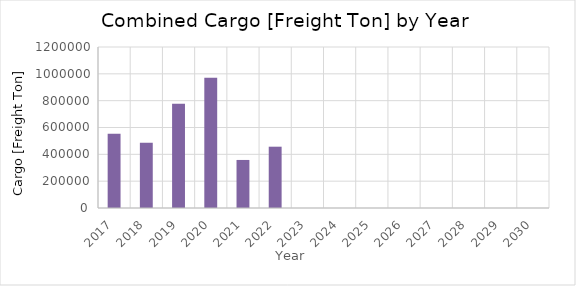
| Category | Total |
|---|---|
| 2017.0 | 553280 |
| 2018.0 | 486761 |
| 2019.0 | 777741 |
| 2020.0 | 970815 |
| 2021.0 | 358114 |
| 2022.0 | 456925 |
| 2023.0 | 0 |
| 2024.0 | 0 |
| 2025.0 | 0 |
| 2026.0 | 0 |
| 2027.0 | 0 |
| 2028.0 | 0 |
| 2029.0 | 0 |
| 2030.0 | 0 |